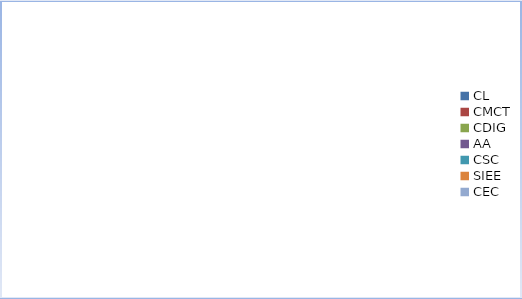
| Category | Series 0 |
|---|---|
| CL | 0 |
| CMCT | 0 |
| CDIG | 0 |
| AA | 0 |
| CSC | 0 |
| SIEE | 0 |
| CEC | 0 |